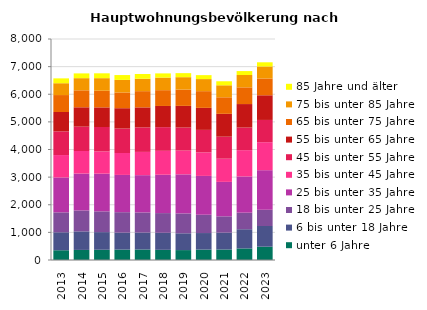
| Category | unter 6 Jahre | 6 bis unter 18 Jahre | 18 bis unter 25 Jahre | 25 bis unter 35 Jahre | 35 bis unter 45 Jahre | 45 bis unter 55 Jahre | 55 bis unter 65 Jahre | 65 bis unter 75 Jahre | 75 bis unter 85 Jahre | 85 Jahre und älter |
|---|---|---|---|---|---|---|---|---|---|---|
| 2013.0 | 353 | 650 | 722 | 1262 | 812 | 857 | 701 | 614 | 428 | 176 |
| 2014.0 | 365 | 671 | 758 | 1334 | 818 | 881 | 701 | 614 | 440 | 173 |
| 2015.0 | 371 | 638 | 752 | 1364 | 806 | 884 | 710 | 602 | 455 | 176 |
| 2016.0 | 377 | 614 | 740 | 1349 | 794 | 884 | 737 | 569 | 455 | 176 |
| 2017.0 | 380 | 614 | 728 | 1349 | 842 | 887 | 725 | 587 | 449 | 173 |
| 2018.0 | 368 | 617 | 713 | 1388 | 866 | 857 | 767 | 572 | 455 | 152 |
| 2019.0 | 359 | 608 | 719 | 1415 | 860 | 833 | 785 | 590 | 449 | 146 |
| 2020.0 | 377 | 599 | 662 | 1406 | 851 | 815 | 797 | 605 | 437 | 143 |
| 2021.0 | 380 | 611 | 590 | 1247 | 839 | 797 | 827 | 599 | 434 | 146 |
| 2022.0 | 419 | 695 | 599 | 1310 | 953 | 818 | 851 | 605 | 446 | 143 |
| 2023.0 | 482 | 749 | 587 | 1433 | 1013 | 806 | 893 | 608 | 434 | 152 |